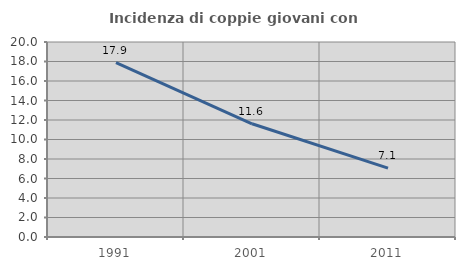
| Category | Incidenza di coppie giovani con figli |
|---|---|
| 1991.0 | 17.879 |
| 2001.0 | 11.611 |
| 2011.0 | 7.062 |